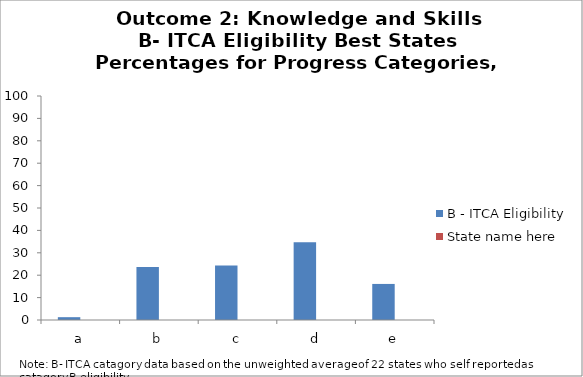
| Category | B - ITCA Eligibility | State name here |
|---|---|---|
| a | 1.26 |  |
| b | 23.7 |  |
| c | 24.3 |  |
| d | 34.7 |  |
| e | 16.1 |  |